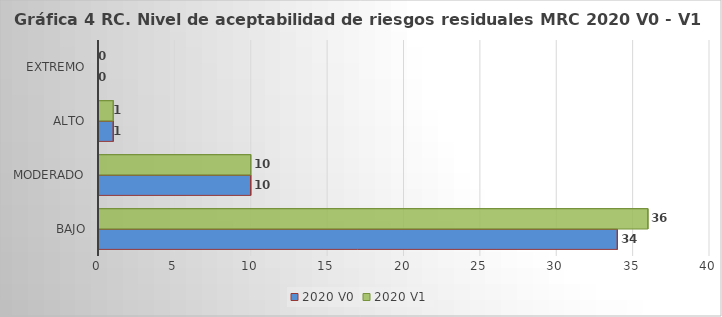
| Category | 2020 V0 | 2020 V1 |
|---|---|---|
| Bajo | 34 | 36 |
| Moderado | 10 | 10 |
| Alto | 1 | 1 |
| Extremo | 0 | 0 |